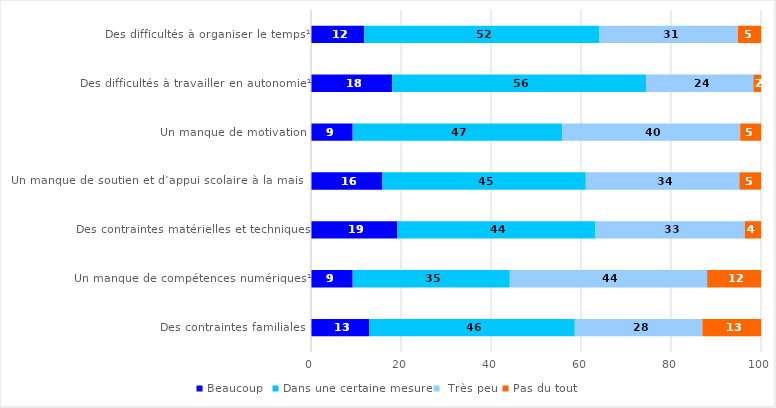
| Category | Beaucoup  | Dans une certaine mesure |  Très peu | Pas du tout |
|---|---|---|---|---|
| Des difficultés à organiser le temps¹ | 11.84 | 52.182 | 30.862 | 5.117 |
| Des difficultés à travailler en autonomie¹ | 18.062 | 56.398 | 23.855 | 1.685 |
| Un manque de motivation | 9.268 | 46.552 | 39.565 | 4.615 |
| Un manque de soutien et d’appui scolaire à la maison | 15.877 | 45.186 | 34.126 | 4.81 |
| Des contraintes matérielles et techniques | 19.19 | 44.026 | 33.175 | 3.61 |
| Un manque de compétences numériques¹ | 9.266 | 34.912 | 43.841 | 11.98 |
| Des contraintes familiales | 12.954 | 45.661 | 28.36 | 13.025 |